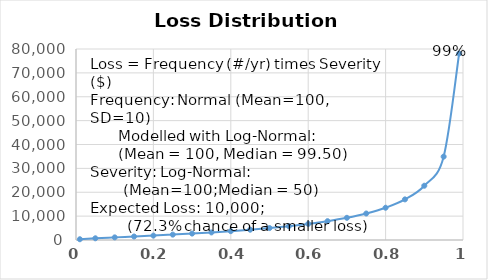
| Category | Series 0 |
|---|---|
| 0.01 | 320.053 |
| 0.05 | 716.021 |
| 0.1 | 1099.896 |
| 0.15 | 1469.373 |
| 0.2 | 1849.688 |
| 0.25 | 2253.516 |
| 0.3 | 2690.778 |
| 0.35 | 3171.361 |
| 0.4 | 3706.524 |
| 0.45 | 4310.105 |
| 0.5 | 5000 |
| 0.55 | 5800.323 |
| 0.6 | 6744.864 |
| 0.65 | 7883.05 |
| 0.7 | 9290.994 |
| 0.75 | 11093.775 |
| 0.8 | 13515.796 |
| 0.85 | 17014.062 |
| 0.9 | 22729.431 |
| 0.95 | 34915.18 |
| 0.99 | 78112.033 |